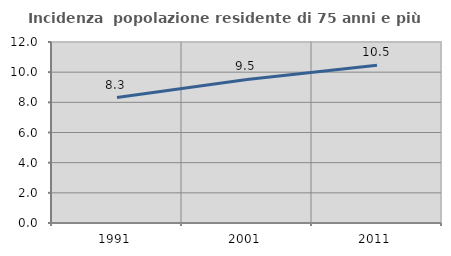
| Category | Incidenza  popolazione residente di 75 anni e più |
|---|---|
| 1991.0 | 8.319 |
| 2001.0 | 9.515 |
| 2011.0 | 10.462 |